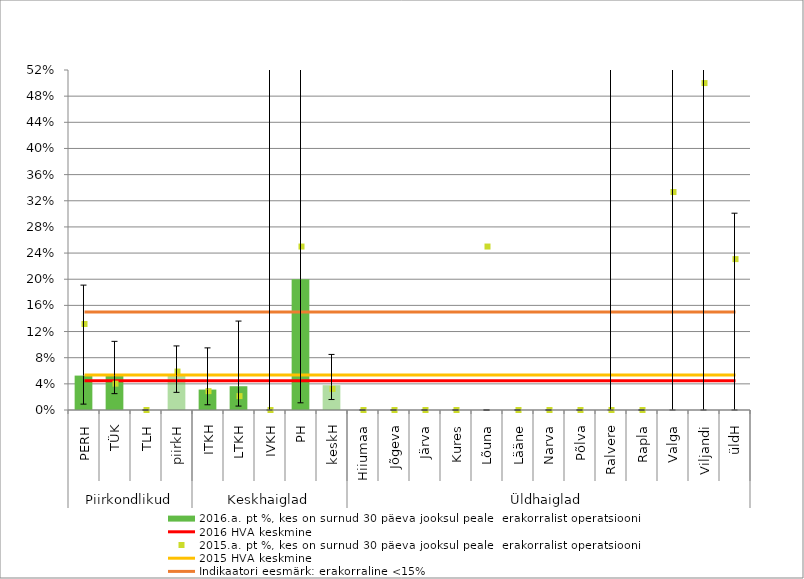
| Category | 2016.a. pt %, kes on surnud 30 päeva jooksul peale  erakorralist operatsiooni |
|---|---|
| 0 | 0.053 |
| 1 | 0.053 |
| 2 | 0 |
| 3 | 0.053 |
| 4 | 0.031 |
| 5 | 0.036 |
| 6 | 0 |
| 7 | 0.2 |
| 8 | 0.038 |
| 9 | 0 |
| 10 | 0 |
| 11 | 0 |
| 12 | 0 |
| 13 | 0 |
| 14 | 0 |
| 15 | 0 |
| 16 | 0 |
| 17 | 0 |
| 18 | 0 |
| 19 | 0 |
| 20 | 0 |
| 21 | 0 |